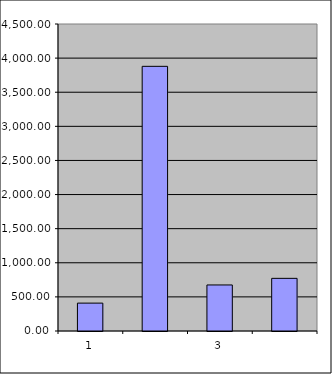
| Category | Series 0 |
|---|---|
| 0 | 408.75 |
| 1 | 3879.509 |
| 2 | 674.938 |
| 3 | 771.809 |